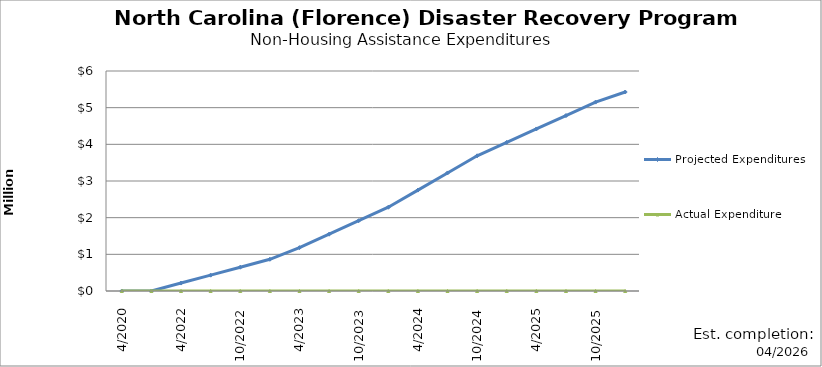
| Category | Projected Expenditures | Actual Expenditure |
|---|---|---|
| 4/2020 | 0 | 0 |
| 1/2022 | 0 | 0 |
| 4/2022 | 216175.68 | 0 |
| 7/2022 | 432351.36 | 0 |
| 10/2022 | 648527.04 | 0 |
| 1/2023 | 864702.72 | 0 |
| 4/2023 | 1182209.28 | 0 |
| 7/2023 | 1549669.6 | 0 |
| 10/2023 | 1917129.92 | 0 |
| 1/2024 | 2284590.24 | 0 |
| 4/2024 | 2752050.56 | 0 |
| 7/2024 | 3219510.88 | 0 |
| 10/2024 | 3686971.2 | 0 |
| 1/2025 | 4053099.52 | 0 |
| 4/2025 | 4419227.84 | 0 |
| 7/2025 | 4785356.16 | 0 |
| 10/2025 | 5151484.48 | 0 |
| 1/2026 | 5426439.8 | 0 |